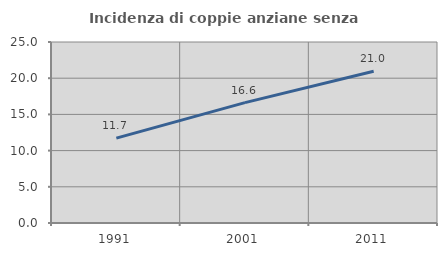
| Category | Incidenza di coppie anziane senza figli  |
|---|---|
| 1991.0 | 11.725 |
| 2001.0 | 16.628 |
| 2011.0 | 20.96 |